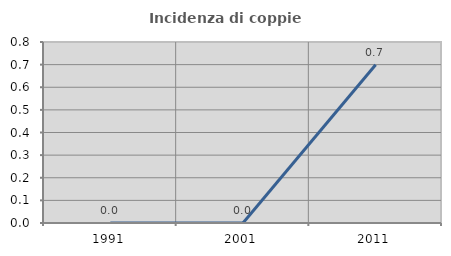
| Category | Incidenza di coppie miste |
|---|---|
| 1991.0 | 0 |
| 2001.0 | 0 |
| 2011.0 | 0.699 |